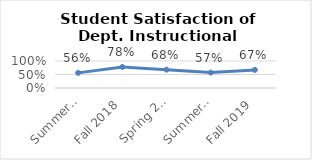
| Category | Series 0 |
|---|---|
| Summer 2018 | 0.56 |
| Fall 2018 | 0.78 |
| Spring 2019 | 0.68 |
| Summer 2019 | 0.57 |
| Fall 2019 | 0.67 |